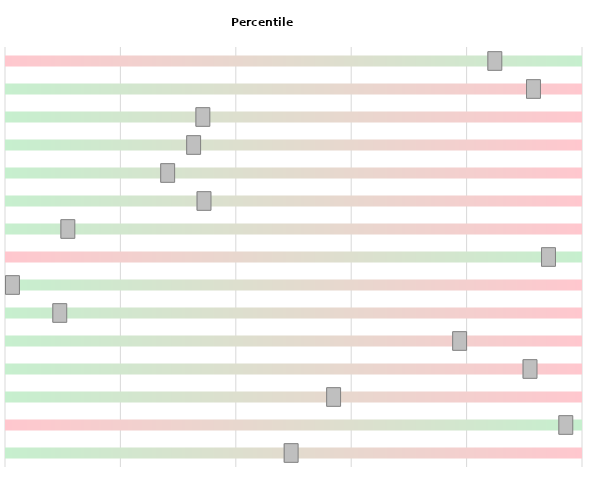
| Category | Spectrum |
|---|---|
| Median Household Income (MHI) | 10 |
| Percent Below Poverty Level | 10 |
| Percent Receiving Public Assistance or SNAP | 10 |
| Percent Receiving Supplemental Security Income | 10 |
| Unemployment Rate (Primary County 12 mo avg) | 10 |
| Percent Not in Labor Force | 10 |
| Percent over Age 65 | 10 |
| Population Trend Between 2010 and 2020 Census | 10 |
| Percent with High School Diploma or Less | 10 |
| Percent of Vacant Homes (excl. Seasonal and Vacation) | 10 |
| Percent of Cost Burdened Housing (>= 30% of Income) | 10 |
| Percent Minority | 10 |
| Social Vulnerability Index of the Primary County | 10 |
| Assessed Valuation/Capita | 10 |
| Outstanding Debt/Capita | 10 |